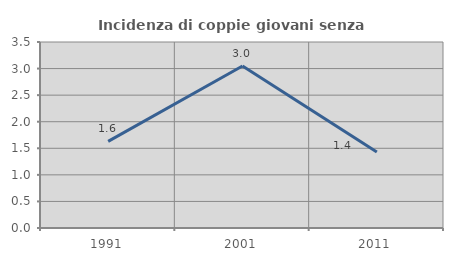
| Category | Incidenza di coppie giovani senza figli |
|---|---|
| 1991.0 | 1.63 |
| 2001.0 | 3.049 |
| 2011.0 | 1.429 |